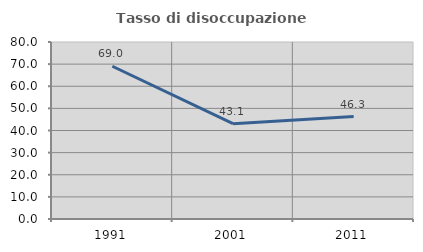
| Category | Tasso di disoccupazione giovanile  |
|---|---|
| 1991.0 | 69.038 |
| 2001.0 | 43.077 |
| 2011.0 | 46.291 |